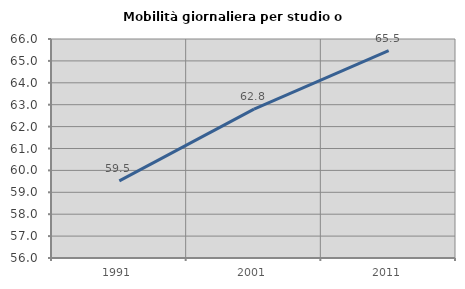
| Category | Mobilità giornaliera per studio o lavoro |
|---|---|
| 1991.0 | 59.525 |
| 2001.0 | 62.797 |
| 2011.0 | 65.467 |